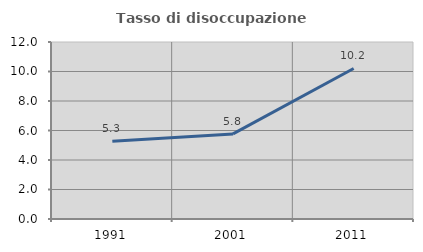
| Category | Tasso di disoccupazione giovanile  |
|---|---|
| 1991.0 | 5.263 |
| 2001.0 | 5.769 |
| 2011.0 | 10.204 |